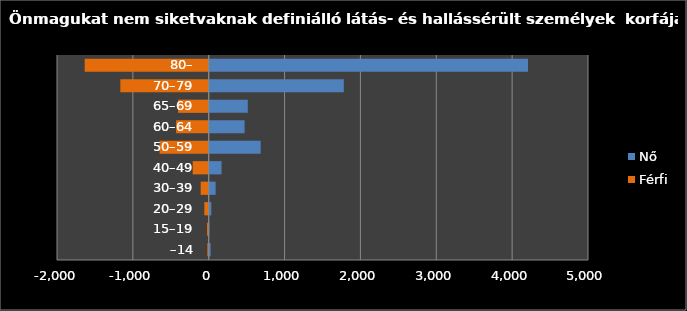
| Category | Nő | Férfi |
|---|---|---|
| –14 | 25 | -18 |
| 15–19 | 8 | -22 |
| 20–29 | 34 | -58 |
| 30–39 | 91 | -106 |
| 40–49 | 169 | -211 |
| 50–59 | 685 | -647 |
| 60–64 | 473 | -430 |
| 65–69 | 515 | -403 |
| 70–79 | 1781 | -1165 |
| 80– | 4209 | -1635 |